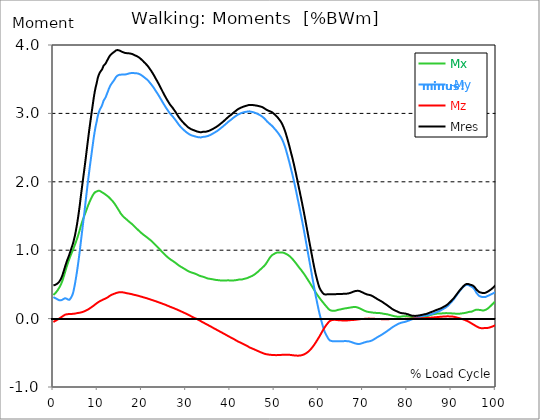
| Category |  Mx |  -My |  Mz |  Mres |
|---|---|---|---|---|
| 0.0 | 0.346 | 0.315 | -0.05 | 0.487 |
| 0.167348456675344 | 0.355 | 0.308 | -0.043 | 0.489 |
| 0.334696913350688 | 0.364 | 0.302 | -0.036 | 0.491 |
| 0.5020453700260321 | 0.376 | 0.298 | -0.031 | 0.495 |
| 0.669393826701376 | 0.389 | 0.293 | -0.025 | 0.502 |
| 0.83674228337672 | 0.403 | 0.285 | -0.019 | 0.508 |
| 1.0040907400520642 | 0.418 | 0.279 | -0.012 | 0.517 |
| 1.1621420602454444 | 0.436 | 0.272 | -0.006 | 0.527 |
| 1.3294905169207885 | 0.453 | 0.268 | 0.001 | 0.54 |
| 1.4968389735961325 | 0.471 | 0.266 | 0.007 | 0.554 |
| 1.6641874302714765 | 0.493 | 0.267 | 0.016 | 0.575 |
| 1.8315358869468206 | 0.519 | 0.272 | 0.023 | 0.599 |
| 1.9988843436221646 | 0.546 | 0.274 | 0.03 | 0.625 |
| 2.1662328002975086 | 0.579 | 0.281 | 0.038 | 0.658 |
| 2.333581256972853 | 0.612 | 0.289 | 0.045 | 0.693 |
| 2.5009297136481967 | 0.648 | 0.295 | 0.051 | 0.728 |
| 2.6682781703235405 | 0.684 | 0.298 | 0.057 | 0.764 |
| 2.8356266269988843 | 0.721 | 0.297 | 0.061 | 0.798 |
| 3.002975083674229 | 0.757 | 0.291 | 0.063 | 0.831 |
| 3.1703235403495724 | 0.791 | 0.283 | 0.064 | 0.86 |
| 3.337671997024917 | 0.821 | 0.278 | 0.065 | 0.888 |
| 3.4957233172182973 | 0.852 | 0.274 | 0.066 | 0.917 |
| 3.663071773893641 | 0.883 | 0.277 | 0.067 | 0.947 |
| 3.8304202305689854 | 0.912 | 0.289 | 0.068 | 0.979 |
| 3.997768687244329 | 0.939 | 0.306 | 0.068 | 1.012 |
| 4.165117143919673 | 0.965 | 0.326 | 0.069 | 1.044 |
| 4.332465600595017 | 0.991 | 0.351 | 0.069 | 1.077 |
| 4.499814057270361 | 1.016 | 0.385 | 0.069 | 1.112 |
| 4.667162513945706 | 1.045 | 0.437 | 0.071 | 1.157 |
| 4.834510970621049 | 1.073 | 0.49 | 0.073 | 1.201 |
| 5.001859427296393 | 1.103 | 0.551 | 0.075 | 1.254 |
| 5.169207883971737 | 1.134 | 0.616 | 0.077 | 1.312 |
| 5.336556340647081 | 1.164 | 0.683 | 0.079 | 1.373 |
| 5.503904797322425 | 1.196 | 0.759 | 0.081 | 1.441 |
| 5.671253253997769 | 1.229 | 0.836 | 0.083 | 1.513 |
| 5.82930457419115 | 1.266 | 0.919 | 0.085 | 1.592 |
| 5.996653030866494 | 1.304 | 1.003 | 0.087 | 1.674 |
| 6.164001487541838 | 1.344 | 1.096 | 0.089 | 1.765 |
| 6.331349944217181 | 1.379 | 1.187 | 0.092 | 1.85 |
| 6.498698400892526 | 1.413 | 1.277 | 0.094 | 1.935 |
| 6.66604685756787 | 1.445 | 1.366 | 0.098 | 2.019 |
| 6.833395314243213 | 1.476 | 1.456 | 0.103 | 2.1 |
| 7.000743770918558 | 1.505 | 1.545 | 0.107 | 2.182 |
| 7.168092227593902 | 1.534 | 1.64 | 0.112 | 2.266 |
| 7.335440684269246 | 1.562 | 1.736 | 0.117 | 2.351 |
| 7.50278914094459 | 1.592 | 1.828 | 0.122 | 2.44 |
| 7.6701375976199335 | 1.621 | 1.921 | 0.127 | 2.529 |
| 7.837486054295278 | 1.65 | 2.009 | 0.133 | 2.616 |
| 7.995537374488658 | 1.677 | 2.098 | 0.139 | 2.701 |
| 8.162885831164003 | 1.703 | 2.184 | 0.146 | 2.784 |
| 8.330234287839346 | 1.727 | 2.264 | 0.154 | 2.863 |
| 8.49758274451469 | 1.751 | 2.345 | 0.162 | 2.94 |
| 8.664931201190035 | 1.774 | 2.425 | 0.169 | 3.019 |
| 8.832279657865378 | 1.794 | 2.505 | 0.177 | 3.094 |
| 8.999628114540721 | 1.812 | 2.585 | 0.184 | 3.17 |
| 9.166976571216066 | 1.829 | 2.662 | 0.193 | 3.242 |
| 9.334325027891412 | 1.841 | 2.73 | 0.201 | 3.307 |
| 9.501673484566755 | 1.851 | 2.792 | 0.21 | 3.364 |
| 9.669021941242098 | 1.856 | 2.844 | 0.218 | 3.41 |
| 9.836370397917442 | 1.86 | 2.893 | 0.226 | 3.454 |
| 10.003718854592787 | 1.867 | 2.951 | 0.234 | 3.507 |
| 10.17106731126813 | 1.87 | 2.993 | 0.241 | 3.545 |
| 10.329118631461512 | 1.87 | 3.025 | 0.248 | 3.573 |
| 10.496467088136853 | 1.867 | 3.054 | 0.253 | 3.596 |
| 10.663815544812199 | 1.861 | 3.075 | 0.259 | 3.612 |
| 10.831164001487544 | 1.853 | 3.094 | 0.264 | 3.626 |
| 10.998512458162887 | 1.846 | 3.118 | 0.269 | 3.643 |
| 11.16586091483823 | 1.84 | 3.148 | 0.275 | 3.666 |
| 11.333209371513574 | 1.836 | 3.183 | 0.281 | 3.695 |
| 11.50055782818892 | 1.827 | 3.202 | 0.286 | 3.708 |
| 11.667906284864264 | 1.818 | 3.219 | 0.29 | 3.718 |
| 11.835254741539607 | 1.811 | 3.239 | 0.294 | 3.733 |
| 12.00260319821495 | 1.804 | 3.265 | 0.3 | 3.751 |
| 12.169951654890292 | 1.795 | 3.295 | 0.307 | 3.774 |
| 12.337300111565641 | 1.786 | 3.321 | 0.313 | 3.792 |
| 12.504648568240984 | 1.778 | 3.351 | 0.321 | 3.815 |
| 12.662699888434362 | 1.766 | 3.377 | 0.329 | 3.832 |
| 12.830048345109708 | 1.756 | 3.4 | 0.336 | 3.849 |
| 12.997396801785053 | 1.743 | 3.42 | 0.342 | 3.861 |
| 13.164745258460396 | 1.733 | 3.436 | 0.348 | 3.87 |
| 13.33209371513574 | 1.721 | 3.45 | 0.352 | 3.879 |
| 13.499442171811083 | 1.709 | 3.464 | 0.356 | 3.887 |
| 13.666790628486426 | 1.696 | 3.479 | 0.361 | 3.894 |
| 13.834139085161771 | 1.681 | 3.496 | 0.364 | 3.904 |
| 14.001487541837117 | 1.664 | 3.515 | 0.369 | 3.913 |
| 14.16883599851246 | 1.649 | 3.532 | 0.373 | 3.921 |
| 14.336184455187803 | 1.631 | 3.543 | 0.377 | 3.925 |
| 14.503532911863147 | 1.614 | 3.552 | 0.38 | 3.926 |
| 14.670881368538492 | 1.596 | 3.56 | 0.382 | 3.926 |
| 14.828932688731873 | 1.579 | 3.563 | 0.384 | 3.922 |
| 14.996281145407215 | 1.562 | 3.564 | 0.386 | 3.917 |
| 15.163629602082558 | 1.543 | 3.566 | 0.387 | 3.912 |
| 15.330978058757903 | 1.528 | 3.566 | 0.387 | 3.906 |
| 15.498326515433247 | 1.514 | 3.567 | 0.386 | 3.901 |
| 15.665674972108594 | 1.502 | 3.567 | 0.384 | 3.896 |
| 15.833023428783937 | 1.492 | 3.568 | 0.382 | 3.893 |
| 16.00037188545928 | 1.48 | 3.569 | 0.38 | 3.89 |
| 16.167720342134626 | 1.47 | 3.569 | 0.378 | 3.885 |
| 16.335068798809967 | 1.462 | 3.57 | 0.375 | 3.883 |
| 16.502417255485312 | 1.452 | 3.572 | 0.373 | 3.881 |
| 16.669765712160658 | 1.443 | 3.575 | 0.37 | 3.88 |
| 16.837114168836 | 1.434 | 3.579 | 0.368 | 3.879 |
| 17.004462625511344 | 1.423 | 3.582 | 0.366 | 3.879 |
| 17.16251394570472 | 1.413 | 3.585 | 0.364 | 3.878 |
| 17.32986240238007 | 1.406 | 3.587 | 0.363 | 3.876 |
| 17.497210859055414 | 1.398 | 3.589 | 0.36 | 3.874 |
| 17.664559315730756 | 1.389 | 3.591 | 0.358 | 3.872 |
| 17.8319077724061 | 1.379 | 3.592 | 0.355 | 3.868 |
| 17.999256229081443 | 1.368 | 3.591 | 0.352 | 3.864 |
| 18.166604685756788 | 1.357 | 3.59 | 0.35 | 3.858 |
| 18.333953142432133 | 1.347 | 3.588 | 0.347 | 3.852 |
| 18.501301599107478 | 1.336 | 3.587 | 0.344 | 3.847 |
| 18.668650055782823 | 1.325 | 3.587 | 0.342 | 3.842 |
| 18.835998512458165 | 1.316 | 3.586 | 0.339 | 3.838 |
| 19.00334696913351 | 1.306 | 3.585 | 0.336 | 3.834 |
| 19.170695425808855 | 1.294 | 3.582 | 0.334 | 3.826 |
| 19.338043882484197 | 1.285 | 3.579 | 0.331 | 3.819 |
| 19.496095202677576 | 1.276 | 3.574 | 0.328 | 3.811 |
| 19.66344365935292 | 1.265 | 3.568 | 0.324 | 3.802 |
| 19.830792116028263 | 1.255 | 3.562 | 0.321 | 3.793 |
| 19.998140572703612 | 1.246 | 3.554 | 0.319 | 3.782 |
| 20.165489029378953 | 1.237 | 3.547 | 0.315 | 3.772 |
| 20.3328374860543 | 1.228 | 3.539 | 0.312 | 3.762 |
| 20.500185942729644 | 1.221 | 3.53 | 0.308 | 3.75 |
| 20.667534399404985 | 1.212 | 3.521 | 0.306 | 3.739 |
| 20.83488285608033 | 1.205 | 3.513 | 0.303 | 3.729 |
| 21.002231312755672 | 1.196 | 3.506 | 0.3 | 3.719 |
| 21.16957976943102 | 1.188 | 3.495 | 0.296 | 3.706 |
| 21.336928226106362 | 1.179 | 3.485 | 0.293 | 3.693 |
| 21.504276682781704 | 1.17 | 3.474 | 0.29 | 3.679 |
| 21.67162513945705 | 1.162 | 3.462 | 0.286 | 3.664 |
| 21.82967645965043 | 1.153 | 3.448 | 0.282 | 3.649 |
| 21.997024916325774 | 1.145 | 3.434 | 0.279 | 3.633 |
| 22.16437337300112 | 1.136 | 3.421 | 0.275 | 3.617 |
| 22.33172182967646 | 1.126 | 3.407 | 0.271 | 3.6 |
| 22.499070286351806 | 1.116 | 3.393 | 0.267 | 3.583 |
| 22.666418743027148 | 1.105 | 3.377 | 0.264 | 3.564 |
| 22.833767199702496 | 1.093 | 3.361 | 0.261 | 3.546 |
| 23.00111565637784 | 1.082 | 3.343 | 0.257 | 3.526 |
| 23.168464113053183 | 1.071 | 3.327 | 0.253 | 3.507 |
| 23.335812569728528 | 1.06 | 3.31 | 0.25 | 3.487 |
| 23.50316102640387 | 1.05 | 3.294 | 0.245 | 3.469 |
| 23.670509483079215 | 1.039 | 3.278 | 0.241 | 3.449 |
| 23.83785793975456 | 1.028 | 3.26 | 0.237 | 3.429 |
| 23.995909259947936 | 1.017 | 3.242 | 0.234 | 3.407 |
| 24.163257716623285 | 1.006 | 3.223 | 0.23 | 3.387 |
| 24.330606173298627 | 0.993 | 3.206 | 0.226 | 3.365 |
| 24.49795462997397 | 0.982 | 3.187 | 0.222 | 3.345 |
| 24.665303086649313 | 0.971 | 3.168 | 0.218 | 3.323 |
| 24.83265154332466 | 0.96 | 3.15 | 0.214 | 3.302 |
| 25.0 | 0.949 | 3.132 | 0.21 | 3.281 |
| 25.167348456675345 | 0.938 | 3.115 | 0.206 | 3.262 |
| 25.334696913350694 | 0.928 | 3.097 | 0.202 | 3.242 |
| 25.502045370026035 | 0.918 | 3.08 | 0.197 | 3.222 |
| 25.669393826701377 | 0.907 | 3.064 | 0.193 | 3.204 |
| 25.836742283376722 | 0.898 | 3.048 | 0.188 | 3.186 |
| 26.004090740052067 | 0.889 | 3.033 | 0.184 | 3.168 |
| 26.17143919672741 | 0.88 | 3.017 | 0.179 | 3.15 |
| 26.329490516920792 | 0.872 | 3.002 | 0.175 | 3.134 |
| 26.49683897359613 | 0.864 | 2.99 | 0.171 | 3.12 |
| 26.66418743027148 | 0.857 | 2.978 | 0.166 | 3.106 |
| 26.831535886946828 | 0.85 | 2.965 | 0.163 | 3.093 |
| 26.998884343622166 | 0.843 | 2.954 | 0.158 | 3.079 |
| 27.166232800297514 | 0.836 | 2.94 | 0.153 | 3.064 |
| 27.333581256972852 | 0.828 | 2.926 | 0.15 | 3.048 |
| 27.5009297136482 | 0.821 | 2.913 | 0.145 | 3.033 |
| 27.668278170323543 | 0.812 | 2.898 | 0.14 | 3.016 |
| 27.835626626998888 | 0.804 | 2.883 | 0.136 | 2.999 |
| 28.002975083674233 | 0.795 | 2.868 | 0.132 | 2.982 |
| 28.170323540349575 | 0.787 | 2.852 | 0.126 | 2.964 |
| 28.33767199702492 | 0.779 | 2.837 | 0.121 | 2.948 |
| 28.50502045370026 | 0.771 | 2.824 | 0.117 | 2.933 |
| 28.663071773893645 | 0.764 | 2.811 | 0.112 | 2.919 |
| 28.830420230568986 | 0.758 | 2.799 | 0.107 | 2.906 |
| 28.99776868724433 | 0.751 | 2.788 | 0.102 | 2.893 |
| 29.165117143919673 | 0.746 | 2.777 | 0.097 | 2.88 |
| 29.33246560059502 | 0.739 | 2.767 | 0.092 | 2.868 |
| 29.499814057270367 | 0.733 | 2.757 | 0.087 | 2.857 |
| 29.66716251394571 | 0.726 | 2.748 | 0.082 | 2.846 |
| 29.834510970621054 | 0.72 | 2.738 | 0.078 | 2.836 |
| 30.00185942729639 | 0.713 | 2.729 | 0.072 | 2.825 |
| 30.169207883971744 | 0.706 | 2.721 | 0.067 | 2.815 |
| 30.33655634064708 | 0.699 | 2.712 | 0.062 | 2.805 |
| 30.50390479732243 | 0.693 | 2.705 | 0.057 | 2.795 |
| 30.671253253997772 | 0.688 | 2.698 | 0.051 | 2.788 |
| 30.829304574191156 | 0.683 | 2.692 | 0.045 | 2.781 |
| 30.996653030866494 | 0.679 | 2.686 | 0.039 | 2.775 |
| 31.164001487541842 | 0.676 | 2.681 | 0.034 | 2.769 |
| 31.331349944217187 | 0.672 | 2.677 | 0.028 | 2.764 |
| 31.498698400892525 | 0.669 | 2.674 | 0.022 | 2.76 |
| 31.666046857567874 | 0.665 | 2.671 | 0.017 | 2.756 |
| 31.833395314243212 | 0.662 | 2.668 | 0.012 | 2.752 |
| 32.00074377091856 | 0.658 | 2.664 | 0.007 | 2.748 |
| 32.1680922275939 | 0.653 | 2.662 | 0.002 | 2.744 |
| 32.33544068426925 | 0.649 | 2.658 | -0.002 | 2.739 |
| 32.50278914094459 | 0.644 | 2.655 | -0.007 | 2.736 |
| 32.670137597619934 | 0.638 | 2.653 | -0.013 | 2.733 |
| 32.83748605429528 | 0.634 | 2.651 | -0.019 | 2.73 |
| 33.004834510970625 | 0.628 | 2.65 | -0.024 | 2.728 |
| 33.162885831164004 | 0.623 | 2.65 | -0.031 | 2.725 |
| 33.33023428783935 | 0.621 | 2.649 | -0.037 | 2.725 |
| 33.497582744514695 | 0.617 | 2.65 | -0.043 | 2.726 |
| 33.664931201190036 | 0.615 | 2.654 | -0.05 | 2.729 |
| 33.83227965786538 | 0.612 | 2.657 | -0.055 | 2.731 |
| 33.99962811454073 | 0.608 | 2.658 | -0.061 | 2.732 |
| 34.16697657121607 | 0.606 | 2.659 | -0.067 | 2.732 |
| 34.33432502789141 | 0.601 | 2.66 | -0.073 | 2.733 |
| 34.50167348456676 | 0.597 | 2.662 | -0.079 | 2.733 |
| 34.6690219412421 | 0.592 | 2.665 | -0.084 | 2.736 |
| 34.83637039791744 | 0.588 | 2.668 | -0.089 | 2.738 |
| 35.00371885459279 | 0.585 | 2.671 | -0.095 | 2.74 |
| 35.17106731126814 | 0.583 | 2.676 | -0.101 | 2.745 |
| 35.338415767943474 | 0.582 | 2.68 | -0.107 | 2.75 |
| 35.49646708813686 | 0.581 | 2.686 | -0.113 | 2.754 |
| 35.6638155448122 | 0.579 | 2.691 | -0.119 | 2.76 |
| 35.831164001487544 | 0.577 | 2.696 | -0.124 | 2.764 |
| 35.998512458162885 | 0.575 | 2.703 | -0.131 | 2.771 |
| 36.165860914838234 | 0.573 | 2.709 | -0.137 | 2.777 |
| 36.333209371513576 | 0.571 | 2.715 | -0.143 | 2.782 |
| 36.50055782818892 | 0.568 | 2.721 | -0.149 | 2.789 |
| 36.667906284864266 | 0.566 | 2.728 | -0.154 | 2.795 |
| 36.83525474153961 | 0.565 | 2.735 | -0.16 | 2.802 |
| 37.002603198214956 | 0.564 | 2.741 | -0.166 | 2.808 |
| 37.1699516548903 | 0.563 | 2.75 | -0.172 | 2.816 |
| 37.337300111565646 | 0.562 | 2.757 | -0.178 | 2.824 |
| 37.50464856824098 | 0.561 | 2.765 | -0.184 | 2.833 |
| 37.66269988843437 | 0.559 | 2.774 | -0.19 | 2.841 |
| 37.83004834510971 | 0.558 | 2.783 | -0.195 | 2.85 |
| 37.99739680178505 | 0.557 | 2.792 | -0.201 | 2.859 |
| 38.16474525846039 | 0.558 | 2.8 | -0.207 | 2.867 |
| 38.33209371513574 | 0.558 | 2.808 | -0.213 | 2.877 |
| 38.49944217181109 | 0.558 | 2.818 | -0.219 | 2.886 |
| 38.666790628486424 | 0.558 | 2.827 | -0.224 | 2.895 |
| 38.83413908516178 | 0.558 | 2.836 | -0.231 | 2.906 |
| 39.001487541837115 | 0.558 | 2.846 | -0.236 | 2.916 |
| 39.16883599851246 | 0.559 | 2.855 | -0.242 | 2.925 |
| 39.336184455187805 | 0.559 | 2.864 | -0.249 | 2.936 |
| 39.503532911863154 | 0.559 | 2.874 | -0.255 | 2.945 |
| 39.670881368538495 | 0.559 | 2.883 | -0.261 | 2.955 |
| 39.83822982521384 | 0.559 | 2.892 | -0.267 | 2.964 |
| 39.996281145407224 | 0.557 | 2.899 | -0.272 | 2.971 |
| 40.163629602082565 | 0.556 | 2.907 | -0.278 | 2.979 |
| 40.33097805875791 | 0.556 | 2.916 | -0.283 | 2.988 |
| 40.498326515433256 | 0.557 | 2.925 | -0.289 | 2.997 |
| 40.6656749721086 | 0.557 | 2.935 | -0.294 | 3.007 |
| 40.83302342878393 | 0.558 | 2.943 | -0.301 | 3.017 |
| 41.00037188545929 | 0.56 | 2.95 | -0.307 | 3.024 |
| 41.16772034213463 | 0.561 | 2.958 | -0.313 | 3.033 |
| 41.33506879880997 | 0.563 | 2.965 | -0.32 | 3.041 |
| 41.50241725548531 | 0.564 | 2.974 | -0.326 | 3.05 |
| 41.66976571216066 | 0.566 | 2.98 | -0.332 | 3.059 |
| 41.837114168836 | 0.569 | 2.986 | -0.336 | 3.064 |
| 42.004462625511344 | 0.571 | 2.991 | -0.342 | 3.07 |
| 42.17181108218669 | 0.57 | 2.996 | -0.347 | 3.077 |
| 42.32986240238007 | 0.57 | 3.002 | -0.351 | 3.081 |
| 42.497210859055414 | 0.571 | 3.005 | -0.357 | 3.086 |
| 42.66455931573076 | 0.572 | 3.008 | -0.363 | 3.09 |
| 42.831907772406105 | 0.575 | 3.014 | -0.367 | 3.095 |
| 42.999256229081446 | 0.579 | 3.016 | -0.373 | 3.1 |
| 43.16660468575679 | 0.582 | 3.019 | -0.379 | 3.103 |
| 43.33395314243214 | 0.584 | 3.021 | -0.384 | 3.107 |
| 43.50130159910748 | 0.586 | 3.022 | -0.389 | 3.109 |
| 43.66865005578282 | 0.589 | 3.024 | -0.394 | 3.112 |
| 43.83599851245817 | 0.593 | 3.026 | -0.4 | 3.115 |
| 44.00334696913351 | 0.597 | 3.028 | -0.407 | 3.119 |
| 44.17069542580886 | 0.602 | 3.03 | -0.414 | 3.122 |
| 44.3380438824842 | 0.607 | 3.03 | -0.421 | 3.124 |
| 44.49609520267758 | 0.611 | 3.027 | -0.425 | 3.123 |
| 44.66344365935292 | 0.616 | 3.024 | -0.43 | 3.122 |
| 44.83079211602827 | 0.621 | 3.023 | -0.434 | 3.122 |
| 44.99814057270361 | 0.626 | 3.021 | -0.438 | 3.121 |
| 45.16548902937895 | 0.632 | 3.018 | -0.443 | 3.121 |
| 45.332837486054295 | 0.638 | 3.015 | -0.448 | 3.121 |
| 45.500185942729644 | 0.646 | 3.011 | -0.452 | 3.119 |
| 45.66753439940499 | 0.654 | 3.007 | -0.457 | 3.117 |
| 45.83488285608033 | 0.663 | 3.003 | -0.463 | 3.115 |
| 46.00223131275568 | 0.671 | 2.998 | -0.467 | 3.113 |
| 46.16957976943102 | 0.68 | 2.993 | -0.472 | 3.111 |
| 46.336928226106366 | 0.69 | 2.988 | -0.477 | 3.108 |
| 46.50427668278171 | 0.7 | 2.981 | -0.481 | 3.106 |
| 46.671625139457056 | 0.71 | 2.976 | -0.486 | 3.104 |
| 46.829676459650436 | 0.719 | 2.971 | -0.491 | 3.101 |
| 46.99702491632577 | 0.729 | 2.964 | -0.495 | 3.098 |
| 47.16437337300112 | 0.741 | 2.956 | -0.499 | 3.093 |
| 47.33172182967646 | 0.75 | 2.948 | -0.504 | 3.088 |
| 47.49907028635181 | 0.758 | 2.939 | -0.507 | 3.082 |
| 47.66641874302716 | 0.769 | 2.929 | -0.512 | 3.076 |
| 47.83376719970249 | 0.781 | 2.918 | -0.516 | 3.069 |
| 48.001115656377834 | 0.795 | 2.907 | -0.519 | 3.062 |
| 48.16846411305319 | 0.811 | 2.893 | -0.521 | 3.053 |
| 48.33581256972853 | 0.828 | 2.881 | -0.522 | 3.047 |
| 48.50316102640387 | 0.845 | 2.872 | -0.524 | 3.043 |
| 48.67050948307921 | 0.863 | 2.863 | -0.526 | 3.039 |
| 48.837857939754564 | 0.879 | 2.852 | -0.528 | 3.035 |
| 49.005206396429905 | 0.894 | 2.842 | -0.529 | 3.03 |
| 49.163257716623285 | 0.909 | 2.833 | -0.53 | 3.025 |
| 49.33060617329863 | 0.921 | 2.824 | -0.531 | 3.021 |
| 49.49795462997397 | 0.931 | 2.814 | -0.532 | 3.015 |
| 49.66530308664932 | 0.937 | 2.803 | -0.533 | 3.007 |
| 49.832651543324666 | 0.942 | 2.791 | -0.533 | 2.996 |
| 50.0 | 0.949 | 2.777 | -0.533 | 2.986 |
| 50.16734845667534 | 0.956 | 2.764 | -0.534 | 2.978 |
| 50.33469691335069 | 0.962 | 2.752 | -0.535 | 2.968 |
| 50.50204537002604 | 0.964 | 2.739 | -0.535 | 2.956 |
| 50.66939382670139 | 0.965 | 2.726 | -0.534 | 2.944 |
| 50.836742283376715 | 0.966 | 2.712 | -0.534 | 2.932 |
| 51.00409074005207 | 0.966 | 2.697 | -0.533 | 2.918 |
| 51.17143919672741 | 0.967 | 2.68 | -0.533 | 2.903 |
| 51.32949051692079 | 0.967 | 2.664 | -0.532 | 2.888 |
| 51.496838973596134 | 0.966 | 2.648 | -0.531 | 2.872 |
| 51.66418743027148 | 0.966 | 2.627 | -0.53 | 2.853 |
| 51.831535886946824 | 0.965 | 2.604 | -0.529 | 2.831 |
| 51.99888434362217 | 0.963 | 2.578 | -0.528 | 2.806 |
| 52.16623280029752 | 0.96 | 2.55 | -0.528 | 2.779 |
| 52.33358125697285 | 0.955 | 2.52 | -0.527 | 2.75 |
| 52.5009297136482 | 0.95 | 2.487 | -0.527 | 2.718 |
| 52.668278170323546 | 0.945 | 2.45 | -0.527 | 2.682 |
| 52.835626626998895 | 0.938 | 2.411 | -0.528 | 2.646 |
| 53.00297508367424 | 0.933 | 2.372 | -0.528 | 2.607 |
| 53.17032354034958 | 0.925 | 2.332 | -0.529 | 2.569 |
| 53.33767199702492 | 0.917 | 2.291 | -0.529 | 2.529 |
| 53.50502045370027 | 0.907 | 2.248 | -0.531 | 2.487 |
| 53.663071773893655 | 0.897 | 2.205 | -0.532 | 2.445 |
| 53.83042023056899 | 0.886 | 2.161 | -0.534 | 2.402 |
| 53.99776868724433 | 0.876 | 2.119 | -0.535 | 2.36 |
| 54.16511714391967 | 0.864 | 2.074 | -0.536 | 2.316 |
| 54.33246560059503 | 0.851 | 2.028 | -0.537 | 2.271 |
| 54.49981405727037 | 0.837 | 1.979 | -0.538 | 2.223 |
| 54.667162513945705 | 0.824 | 1.93 | -0.54 | 2.174 |
| 54.834510970621054 | 0.81 | 1.879 | -0.541 | 2.125 |
| 55.0018594272964 | 0.796 | 1.828 | -0.541 | 2.074 |
| 55.169207883971744 | 0.782 | 1.775 | -0.542 | 2.022 |
| 55.336556340647086 | 0.767 | 1.722 | -0.542 | 1.97 |
| 55.50390479732243 | 0.753 | 1.669 | -0.541 | 1.919 |
| 55.671253253997776 | 0.739 | 1.616 | -0.54 | 1.867 |
| 55.83860171067312 | 0.725 | 1.563 | -0.538 | 1.815 |
| 55.9966530308665 | 0.713 | 1.51 | -0.537 | 1.764 |
| 56.16400148754184 | 0.699 | 1.455 | -0.535 | 1.712 |
| 56.33134994421718 | 0.684 | 1.399 | -0.532 | 1.658 |
| 56.498698400892536 | 0.669 | 1.343 | -0.528 | 1.603 |
| 56.66604685756788 | 0.654 | 1.286 | -0.524 | 1.548 |
| 56.83339531424321 | 0.638 | 1.227 | -0.519 | 1.491 |
| 57.00074377091856 | 0.622 | 1.166 | -0.512 | 1.432 |
| 57.16809222759391 | 0.606 | 1.106 | -0.506 | 1.373 |
| 57.33544068426925 | 0.589 | 1.046 | -0.498 | 1.315 |
| 57.5027891409446 | 0.572 | 0.985 | -0.491 | 1.256 |
| 57.670137597619934 | 0.555 | 0.924 | -0.482 | 1.197 |
| 57.83748605429528 | 0.538 | 0.864 | -0.473 | 1.139 |
| 58.004834510970625 | 0.521 | 0.804 | -0.462 | 1.082 |
| 58.16288583116401 | 0.504 | 0.744 | -0.45 | 1.025 |
| 58.330234287839346 | 0.486 | 0.683 | -0.437 | 0.967 |
| 58.497582744514695 | 0.469 | 0.622 | -0.423 | 0.91 |
| 58.66493120119004 | 0.451 | 0.563 | -0.41 | 0.853 |
| 58.832279657865385 | 0.434 | 0.503 | -0.396 | 0.797 |
| 58.999628114540734 | 0.417 | 0.443 | -0.381 | 0.744 |
| 59.16697657121607 | 0.399 | 0.385 | -0.364 | 0.693 |
| 59.33432502789142 | 0.381 | 0.33 | -0.349 | 0.645 |
| 59.50167348456676 | 0.364 | 0.277 | -0.331 | 0.601 |
| 59.66902194124211 | 0.349 | 0.224 | -0.314 | 0.559 |
| 59.83637039791745 | 0.333 | 0.173 | -0.296 | 0.52 |
| 60.00371885459278 | 0.318 | 0.122 | -0.279 | 0.483 |
| 60.17106731126813 | 0.303 | 0.076 | -0.261 | 0.451 |
| 60.33841576794349 | 0.289 | 0.033 | -0.242 | 0.43 |
| 60.49646708813685 | 0.275 | -0.009 | -0.222 | 0.411 |
| 60.6638155448122 | 0.261 | -0.05 | -0.204 | 0.395 |
| 60.831164001487544 | 0.247 | -0.089 | -0.184 | 0.38 |
| 60.99851245816289 | 0.234 | -0.126 | -0.165 | 0.367 |
| 61.16586091483824 | 0.221 | -0.161 | -0.148 | 0.358 |
| 61.333209371513576 | 0.207 | -0.191 | -0.13 | 0.353 |
| 61.50055782818892 | 0.194 | -0.215 | -0.113 | 0.352 |
| 61.667906284864266 | 0.182 | -0.236 | -0.098 | 0.353 |
| 61.835254741539615 | 0.169 | -0.255 | -0.084 | 0.354 |
| 62.002603198214956 | 0.157 | -0.275 | -0.07 | 0.354 |
| 62.16995165489029 | 0.144 | -0.293 | -0.057 | 0.354 |
| 62.33730011156564 | 0.134 | -0.307 | -0.045 | 0.354 |
| 62.504648568240995 | 0.125 | -0.319 | -0.035 | 0.356 |
| 62.67199702491633 | 0.121 | -0.321 | -0.029 | 0.355 |
| 62.83004834510971 | 0.118 | -0.326 | -0.025 | 0.356 |
| 62.99739680178505 | 0.115 | -0.33 | -0.021 | 0.357 |
| 63.1647452584604 | 0.113 | -0.332 | -0.02 | 0.357 |
| 63.33209371513575 | 0.113 | -0.334 | -0.019 | 0.357 |
| 63.4994421718111 | 0.114 | -0.333 | -0.019 | 0.356 |
| 63.666790628486424 | 0.115 | -0.333 | -0.018 | 0.356 |
| 63.83413908516177 | 0.117 | -0.333 | -0.018 | 0.357 |
| 64.00148754183712 | 0.121 | -0.333 | -0.02 | 0.358 |
| 64.16883599851248 | 0.124 | -0.333 | -0.021 | 0.359 |
| 64.3361844551878 | 0.128 | -0.333 | -0.022 | 0.36 |
| 64.50353291186315 | 0.13 | -0.332 | -0.023 | 0.36 |
| 64.6708813685385 | 0.132 | -0.331 | -0.023 | 0.36 |
| 64.83822982521384 | 0.133 | -0.331 | -0.024 | 0.36 |
| 65.00557828188919 | 0.136 | -0.331 | -0.025 | 0.36 |
| 65.16362960208257 | 0.138 | -0.331 | -0.026 | 0.361 |
| 65.3309780587579 | 0.141 | -0.33 | -0.027 | 0.362 |
| 65.49832651543326 | 0.144 | -0.33 | -0.027 | 0.362 |
| 65.6656749721086 | 0.146 | -0.33 | -0.027 | 0.363 |
| 65.83302342878395 | 0.148 | -0.329 | -0.027 | 0.363 |
| 66.00037188545929 | 0.15 | -0.329 | -0.027 | 0.364 |
| 66.16772034213463 | 0.151 | -0.329 | -0.027 | 0.364 |
| 66.33506879880998 | 0.153 | -0.33 | -0.027 | 0.365 |
| 66.50241725548531 | 0.154 | -0.33 | -0.026 | 0.365 |
| 66.66976571216065 | 0.156 | -0.331 | -0.025 | 0.367 |
| 66.83711416883601 | 0.159 | -0.333 | -0.025 | 0.37 |
| 67.00446262551135 | 0.16 | -0.336 | -0.023 | 0.373 |
| 67.1718110821867 | 0.162 | -0.338 | -0.022 | 0.377 |
| 67.32986240238007 | 0.164 | -0.342 | -0.021 | 0.38 |
| 67.49721085905541 | 0.165 | -0.346 | -0.021 | 0.385 |
| 67.66455931573076 | 0.167 | -0.35 | -0.021 | 0.389 |
| 67.83190777240611 | 0.169 | -0.353 | -0.02 | 0.393 |
| 67.99925622908145 | 0.17 | -0.357 | -0.019 | 0.397 |
| 68.16660468575678 | 0.17 | -0.362 | -0.018 | 0.401 |
| 68.33395314243214 | 0.169 | -0.364 | -0.017 | 0.403 |
| 68.50130159910749 | 0.167 | -0.366 | -0.015 | 0.405 |
| 68.66865005578282 | 0.164 | -0.37 | -0.014 | 0.407 |
| 68.83599851245816 | 0.162 | -0.371 | -0.013 | 0.407 |
| 69.00334696913352 | 0.157 | -0.372 | -0.011 | 0.406 |
| 69.17069542580886 | 0.152 | -0.371 | -0.01 | 0.404 |
| 69.3380438824842 | 0.148 | -0.369 | -0.008 | 0.399 |
| 69.50539233915956 | 0.142 | -0.366 | -0.007 | 0.394 |
| 69.66344365935292 | 0.136 | -0.364 | -0.007 | 0.39 |
| 69.83079211602826 | 0.131 | -0.36 | -0.007 | 0.385 |
| 69.99814057270362 | 0.125 | -0.355 | -0.006 | 0.379 |
| 70.16548902937896 | 0.121 | -0.351 | -0.005 | 0.374 |
| 70.33283748605429 | 0.115 | -0.35 | -0.004 | 0.369 |
| 70.50018594272964 | 0.111 | -0.346 | -0.003 | 0.364 |
| 70.667534399405 | 0.107 | -0.342 | -0.002 | 0.36 |
| 70.83488285608033 | 0.103 | -0.338 | -0.002 | 0.355 |
| 71.00223131275568 | 0.1 | -0.336 | -0.001 | 0.352 |
| 71.16957976943102 | 0.098 | -0.335 | -0.001 | 0.35 |
| 71.33692822610637 | 0.096 | -0.334 | 0 | 0.348 |
| 71.50427668278171 | 0.094 | -0.332 | 0 | 0.346 |
| 71.67162513945706 | 0.093 | -0.328 | -0.001 | 0.342 |
| 71.8389735961324 | 0.092 | -0.325 | -0.001 | 0.339 |
| 71.99702491632577 | 0.09 | -0.321 | -0.002 | 0.335 |
| 72.16437337300113 | 0.088 | -0.316 | -0.002 | 0.329 |
| 72.33172182967647 | 0.087 | -0.309 | -0.003 | 0.322 |
| 72.49907028635181 | 0.086 | -0.303 | -0.004 | 0.316 |
| 72.66641874302715 | 0.085 | -0.297 | -0.004 | 0.309 |
| 72.8337671997025 | 0.084 | -0.29 | -0.005 | 0.303 |
| 73.00111565637783 | 0.083 | -0.282 | -0.006 | 0.295 |
| 73.16846411305319 | 0.082 | -0.276 | -0.006 | 0.289 |
| 73.33581256972853 | 0.082 | -0.269 | -0.007 | 0.282 |
| 73.50316102640387 | 0.082 | -0.263 | -0.007 | 0.276 |
| 73.67050948307921 | 0.081 | -0.257 | -0.007 | 0.27 |
| 73.83785793975457 | 0.08 | -0.251 | -0.007 | 0.264 |
| 74.00520639642991 | 0.079 | -0.245 | -0.007 | 0.259 |
| 74.16325771662328 | 0.078 | -0.238 | -0.007 | 0.252 |
| 74.33060617329863 | 0.076 | -0.232 | -0.008 | 0.245 |
| 74.49795462997398 | 0.073 | -0.225 | -0.008 | 0.238 |
| 74.66530308664932 | 0.071 | -0.218 | -0.008 | 0.231 |
| 74.83265154332466 | 0.069 | -0.21 | -0.008 | 0.223 |
| 75.00000000000001 | 0.067 | -0.203 | -0.008 | 0.216 |
| 75.16734845667534 | 0.066 | -0.196 | -0.008 | 0.209 |
| 75.3346969133507 | 0.064 | -0.189 | -0.008 | 0.202 |
| 75.50204537002605 | 0.063 | -0.181 | -0.008 | 0.194 |
| 75.66939382670138 | 0.06 | -0.173 | -0.008 | 0.186 |
| 75.83674228337672 | 0.057 | -0.165 | -0.008 | 0.178 |
| 76.00409074005208 | 0.054 | -0.158 | -0.007 | 0.17 |
| 76.17143919672742 | 0.051 | -0.15 | -0.007 | 0.163 |
| 76.33878765340276 | 0.049 | -0.142 | -0.007 | 0.154 |
| 76.49683897359614 | 0.045 | -0.134 | -0.007 | 0.146 |
| 76.66418743027148 | 0.042 | -0.126 | -0.007 | 0.138 |
| 76.83153588694682 | 0.039 | -0.12 | -0.007 | 0.132 |
| 76.99888434362218 | 0.037 | -0.113 | -0.006 | 0.126 |
| 77.16623280029752 | 0.035 | -0.107 | -0.006 | 0.121 |
| 77.33358125697285 | 0.033 | -0.1 | -0.006 | 0.116 |
| 77.5009297136482 | 0.031 | -0.094 | -0.005 | 0.111 |
| 77.66827817032356 | 0.029 | -0.089 | -0.005 | 0.107 |
| 77.83562662699889 | 0.027 | -0.082 | -0.005 | 0.101 |
| 78.00297508367423 | 0.027 | -0.077 | -0.006 | 0.095 |
| 78.17032354034959 | 0.027 | -0.072 | -0.006 | 0.091 |
| 78.33767199702493 | 0.027 | -0.067 | -0.006 | 0.087 |
| 78.50502045370027 | 0.028 | -0.064 | -0.006 | 0.083 |
| 78.67236891037561 | 0.03 | -0.06 | -0.006 | 0.08 |
| 78.83042023056899 | 0.032 | -0.057 | -0.005 | 0.079 |
| 78.99776868724433 | 0.034 | -0.054 | -0.005 | 0.078 |
| 79.16511714391969 | 0.035 | -0.052 | -0.005 | 0.077 |
| 79.33246560059503 | 0.036 | -0.05 | -0.005 | 0.076 |
| 79.49981405727036 | 0.036 | -0.048 | -0.004 | 0.075 |
| 79.66716251394571 | 0.036 | -0.045 | -0.004 | 0.073 |
| 79.83451097062107 | 0.036 | -0.041 | -0.004 | 0.069 |
| 80.00185942729641 | 0.036 | -0.036 | -0.003 | 0.066 |
| 80.16920788397174 | 0.036 | -0.033 | -0.003 | 0.064 |
| 80.33655634064709 | 0.034 | -0.029 | -0.003 | 0.059 |
| 80.50390479732243 | 0.031 | -0.025 | -0.002 | 0.055 |
| 80.67125325399778 | 0.028 | -0.021 | -0.002 | 0.05 |
| 80.83860171067312 | 0.025 | -0.017 | -0.001 | 0.047 |
| 80.99665303086651 | 0.022 | -0.013 | -0.001 | 0.044 |
| 81.16400148754184 | 0.02 | -0.008 | -0.001 | 0.042 |
| 81.3313499442172 | 0.017 | -0.004 | 0 | 0.041 |
| 81.49869840089255 | 0.014 | 0.001 | 0 | 0.04 |
| 81.66604685756786 | 0.01 | 0.005 | 0 | 0.04 |
| 81.83339531424322 | 0.008 | 0.008 | 0 | 0.039 |
| 82.00074377091858 | 0.006 | 0.012 | 0.001 | 0.041 |
| 82.16809222759392 | 0.005 | 0.015 | 0.001 | 0.042 |
| 82.33544068426926 | 0.005 | 0.017 | 0.001 | 0.043 |
| 82.50278914094459 | 0.006 | 0.02 | 0.001 | 0.044 |
| 82.67013759761994 | 0.006 | 0.023 | 0.001 | 0.045 |
| 82.83748605429528 | 0.007 | 0.026 | 0.002 | 0.048 |
| 83.00483451097062 | 0.008 | 0.029 | 0.003 | 0.05 |
| 83.17218296764597 | 0.01 | 0.032 | 0.003 | 0.052 |
| 83.33023428783935 | 0.012 | 0.035 | 0.004 | 0.055 |
| 83.4975827445147 | 0.014 | 0.037 | 0.005 | 0.057 |
| 83.66493120119004 | 0.017 | 0.04 | 0.005 | 0.059 |
| 83.83227965786537 | 0.02 | 0.042 | 0.006 | 0.062 |
| 83.99962811454073 | 0.023 | 0.044 | 0.007 | 0.064 |
| 84.16697657121607 | 0.026 | 0.046 | 0.007 | 0.065 |
| 84.33432502789142 | 0.03 | 0.047 | 0.007 | 0.068 |
| 84.50167348456677 | 0.034 | 0.05 | 0.009 | 0.072 |
| 84.6690219412421 | 0.038 | 0.051 | 0.01 | 0.075 |
| 84.83637039791745 | 0.043 | 0.054 | 0.011 | 0.08 |
| 85.0037188545928 | 0.047 | 0.056 | 0.012 | 0.084 |
| 85.17106731126813 | 0.05 | 0.059 | 0.013 | 0.089 |
| 85.33841576794349 | 0.054 | 0.062 | 0.014 | 0.093 |
| 85.50576422461883 | 0.057 | 0.065 | 0.015 | 0.097 |
| 85.66381554481221 | 0.059 | 0.069 | 0.016 | 0.101 |
| 85.83116400148755 | 0.062 | 0.073 | 0.017 | 0.105 |
| 85.99851245816289 | 0.064 | 0.077 | 0.018 | 0.109 |
| 86.16586091483823 | 0.066 | 0.081 | 0.019 | 0.114 |
| 86.33320937151358 | 0.068 | 0.086 | 0.019 | 0.119 |
| 86.50055782818893 | 0.07 | 0.09 | 0.02 | 0.123 |
| 86.66790628486427 | 0.072 | 0.093 | 0.021 | 0.127 |
| 86.83525474153961 | 0.074 | 0.097 | 0.022 | 0.131 |
| 87.00260319821496 | 0.074 | 0.102 | 0.023 | 0.136 |
| 87.16995165489031 | 0.073 | 0.107 | 0.024 | 0.139 |
| 87.33730011156564 | 0.074 | 0.112 | 0.025 | 0.143 |
| 87.504648568241 | 0.075 | 0.118 | 0.026 | 0.147 |
| 87.67199702491634 | 0.075 | 0.123 | 0.027 | 0.151 |
| 87.83004834510972 | 0.076 | 0.129 | 0.028 | 0.157 |
| 87.99739680178506 | 0.078 | 0.135 | 0.029 | 0.163 |
| 88.1647452584604 | 0.079 | 0.141 | 0.03 | 0.169 |
| 88.33209371513574 | 0.079 | 0.148 | 0.031 | 0.175 |
| 88.49944217181108 | 0.079 | 0.153 | 0.031 | 0.18 |
| 88.66679062848644 | 0.079 | 0.161 | 0.032 | 0.187 |
| 88.83413908516178 | 0.08 | 0.167 | 0.033 | 0.193 |
| 89.00148754183712 | 0.08 | 0.177 | 0.033 | 0.202 |
| 89.16883599851246 | 0.079 | 0.185 | 0.033 | 0.209 |
| 89.33618445518782 | 0.079 | 0.195 | 0.033 | 0.22 |
| 89.50353291186315 | 0.079 | 0.207 | 0.032 | 0.23 |
| 89.6708813685385 | 0.079 | 0.218 | 0.032 | 0.24 |
| 89.83822982521386 | 0.078 | 0.23 | 0.032 | 0.25 |
| 90.00557828188919 | 0.077 | 0.242 | 0.031 | 0.263 |
| 90.16362960208257 | 0.076 | 0.254 | 0.03 | 0.273 |
| 90.3309780587579 | 0.076 | 0.266 | 0.029 | 0.283 |
| 90.49832651543326 | 0.076 | 0.279 | 0.027 | 0.295 |
| 90.66567497210859 | 0.075 | 0.293 | 0.025 | 0.308 |
| 90.83302342878395 | 0.073 | 0.309 | 0.022 | 0.323 |
| 91.00037188545929 | 0.072 | 0.325 | 0.02 | 0.338 |
| 91.16772034213463 | 0.071 | 0.34 | 0.017 | 0.352 |
| 91.33506879880998 | 0.071 | 0.355 | 0.014 | 0.367 |
| 91.50241725548533 | 0.071 | 0.37 | 0.011 | 0.381 |
| 91.66976571216065 | 0.071 | 0.385 | 0.008 | 0.395 |
| 91.83711416883601 | 0.072 | 0.4 | 0.005 | 0.41 |
| 92.00446262551137 | 0.073 | 0.414 | 0.002 | 0.423 |
| 92.1718110821867 | 0.074 | 0.425 | -0.002 | 0.435 |
| 92.33915953886203 | 0.076 | 0.437 | -0.005 | 0.447 |
| 92.49721085905541 | 0.078 | 0.45 | -0.008 | 0.459 |
| 92.66455931573077 | 0.079 | 0.461 | -0.011 | 0.47 |
| 92.83190777240611 | 0.08 | 0.471 | -0.015 | 0.481 |
| 92.99925622908145 | 0.083 | 0.479 | -0.019 | 0.491 |
| 93.1666046857568 | 0.084 | 0.487 | -0.023 | 0.498 |
| 93.33395314243214 | 0.087 | 0.492 | -0.028 | 0.504 |
| 93.50130159910749 | 0.089 | 0.494 | -0.034 | 0.507 |
| 93.66865005578283 | 0.092 | 0.493 | -0.038 | 0.507 |
| 93.83599851245818 | 0.095 | 0.491 | -0.044 | 0.506 |
| 94.00334696913353 | 0.098 | 0.485 | -0.05 | 0.503 |
| 94.17069542580886 | 0.1 | 0.479 | -0.055 | 0.497 |
| 94.3380438824842 | 0.099 | 0.472 | -0.062 | 0.493 |
| 94.50539233915954 | 0.101 | 0.468 | -0.068 | 0.492 |
| 94.66344365935292 | 0.105 | 0.464 | -0.075 | 0.49 |
| 94.83079211602828 | 0.108 | 0.455 | -0.081 | 0.483 |
| 94.99814057270362 | 0.115 | 0.446 | -0.088 | 0.478 |
| 95.16548902937897 | 0.12 | 0.431 | -0.094 | 0.466 |
| 95.33283748605432 | 0.124 | 0.415 | -0.101 | 0.453 |
| 95.50018594272963 | 0.128 | 0.397 | -0.107 | 0.44 |
| 95.66753439940499 | 0.131 | 0.377 | -0.113 | 0.424 |
| 95.83488285608034 | 0.13 | 0.365 | -0.12 | 0.416 |
| 96.00223131275567 | 0.129 | 0.35 | -0.125 | 0.404 |
| 96.16957976943102 | 0.128 | 0.338 | -0.13 | 0.393 |
| 96.33692822610638 | 0.127 | 0.329 | -0.135 | 0.386 |
| 96.50427668278171 | 0.126 | 0.324 | -0.138 | 0.383 |
| 96.67162513945706 | 0.124 | 0.321 | -0.139 | 0.38 |
| 96.8389735961324 | 0.121 | 0.318 | -0.14 | 0.378 |
| 96.99702491632577 | 0.119 | 0.315 | -0.14 | 0.375 |
| 97.16437337300111 | 0.118 | 0.314 | -0.14 | 0.373 |
| 97.33172182967647 | 0.12 | 0.315 | -0.139 | 0.374 |
| 97.49907028635181 | 0.122 | 0.317 | -0.138 | 0.377 |
| 97.66641874302715 | 0.127 | 0.315 | -0.138 | 0.377 |
| 97.8337671997025 | 0.132 | 0.318 | -0.139 | 0.38 |
| 98.00111565637785 | 0.136 | 0.325 | -0.138 | 0.387 |
| 98.16846411305319 | 0.144 | 0.329 | -0.137 | 0.393 |
| 98.33581256972855 | 0.152 | 0.335 | -0.135 | 0.399 |
| 98.50316102640389 | 0.162 | 0.34 | -0.132 | 0.407 |
| 98.67050948307921 | 0.17 | 0.345 | -0.13 | 0.413 |
| 98.83785793975456 | 0.182 | 0.35 | -0.126 | 0.421 |
| 99.0052063964299 | 0.193 | 0.355 | -0.121 | 0.429 |
| 99.17255485310525 | 0.204 | 0.361 | -0.118 | 0.438 |
| 99.33060617329863 | 0.214 | 0.365 | -0.114 | 0.447 |
| 99.49795462997399 | 0.224 | 0.371 | -0.109 | 0.456 |
| 99.66530308664933 | 0.236 | 0.378 | -0.105 | 0.467 |
| 99.83265154332467 | 0.248 | 0.384 | -0.1 | 0.478 |
| 100.0 | 0.26 | 0.389 | -0.095 | 0.488 |